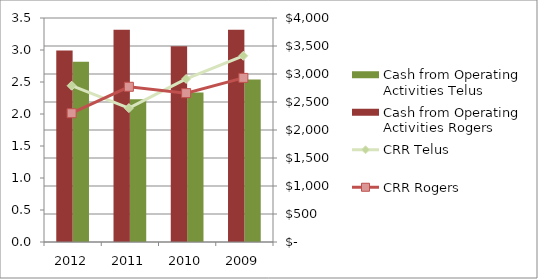
| Category | Cash from Operating Activities Telus | Cash from Operating Activities Rogers |
|---|---|---|
| 2009.0 | 2904 | 3790 |
| 2010.0 | 2670 | 3494 |
| 2011.0 | 2550 | 3791 |
| 2012.0 | 3219 | 3421 |